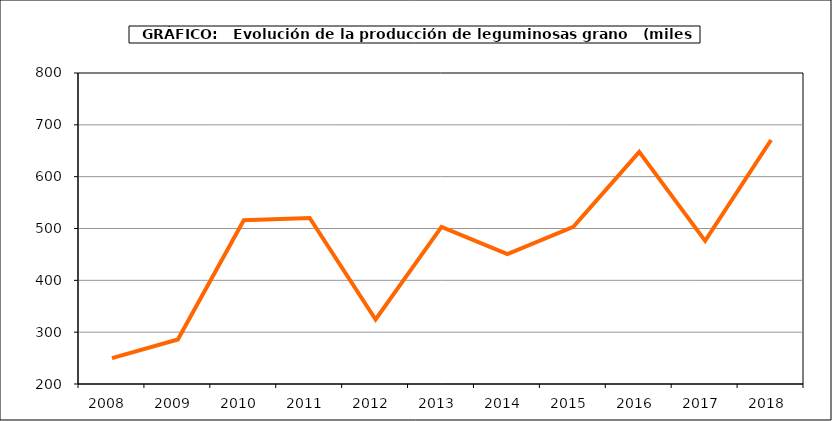
| Category | Producción |
|---|---|
| 2008.0 | 249.984 |
| 2009.0 | 285.879 |
| 2010.0 | 515.802 |
| 2011.0 | 520.288 |
| 2012.0 | 324.471 |
| 2013.0 | 503.069 |
| 2014.0 | 450.507 |
| 2015.0 | 503.331 |
| 2016.0 | 647.72 |
| 2017.0 | 476.139 |
| 2018.0 | 670.719 |